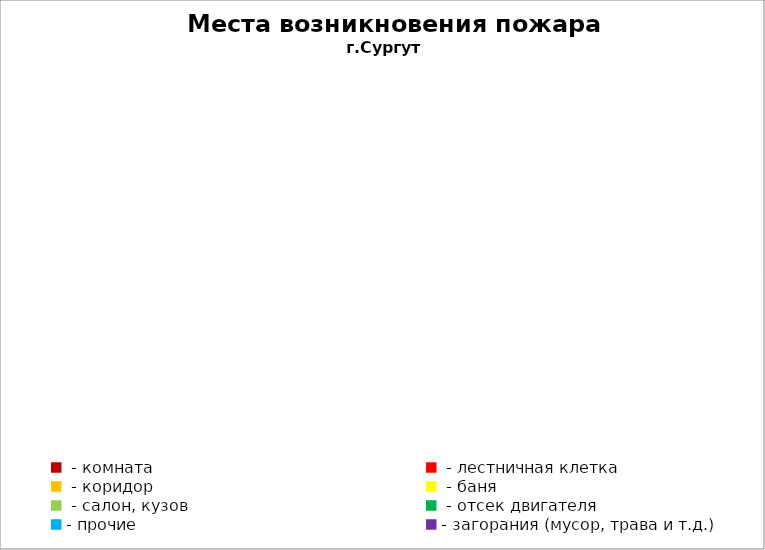
| Category | Места возникновения пожара |
|---|---|
|  - комната | 84 |
|  - лестничная клетка | 39 |
|  - коридор | 5 |
|  - баня | 63 |
|  - салон, кузов | 32 |
|  - отсек двигателя | 31 |
| - прочие | 137 |
| - загорания (мусор, трава и т.д.)  | 194 |